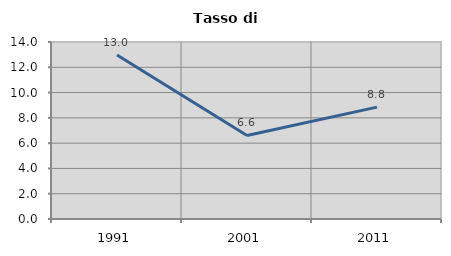
| Category | Tasso di disoccupazione   |
|---|---|
| 1991.0 | 12.966 |
| 2001.0 | 6.607 |
| 2011.0 | 8.85 |